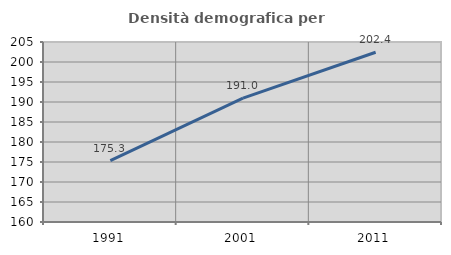
| Category | Densità demografica |
|---|---|
| 1991.0 | 175.323 |
| 2001.0 | 190.95 |
| 2011.0 | 202.435 |